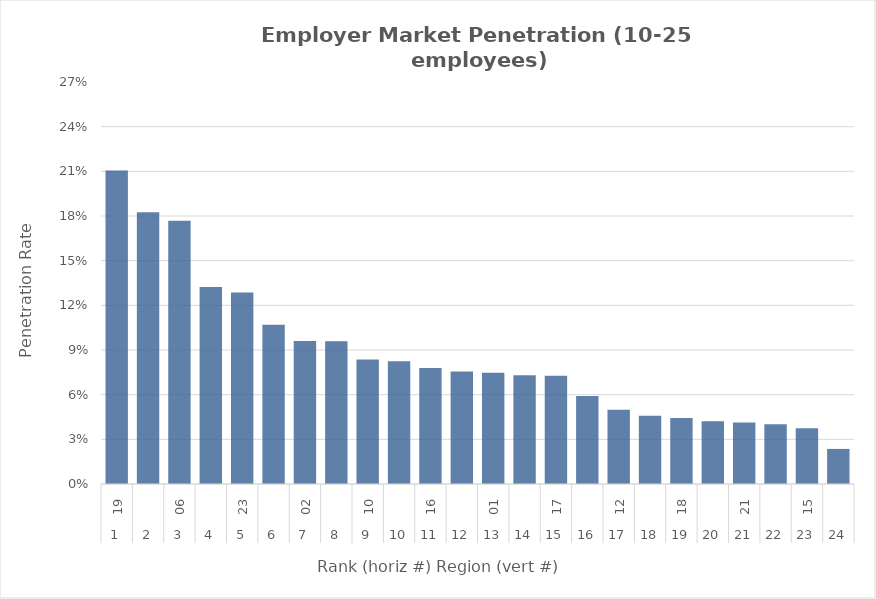
| Category | Rate |
|---|---|
| 0 | 0.211 |
| 1 | 0.183 |
| 2 | 0.177 |
| 3 | 0.132 |
| 4 | 0.129 |
| 5 | 0.107 |
| 6 | 0.096 |
| 7 | 0.096 |
| 8 | 0.084 |
| 9 | 0.082 |
| 10 | 0.078 |
| 11 | 0.076 |
| 12 | 0.075 |
| 13 | 0.073 |
| 14 | 0.073 |
| 15 | 0.059 |
| 16 | 0.05 |
| 17 | 0.046 |
| 18 | 0.044 |
| 19 | 0.042 |
| 20 | 0.041 |
| 21 | 0.04 |
| 22 | 0.037 |
| 23 | 0.024 |